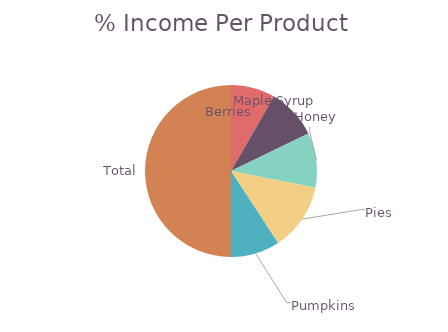
| Category | Total 
Income |
|---|---|
| Berries | 196.75 |
| Maple Syrup | 224.625 |
| Honey | 244 |
| Pies | 300 |
| Pumpkins | 218.4 |